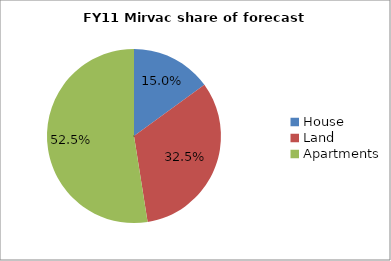
| Category | Series 0 |
|---|---|
| House  | 0.15 |
| Land | 0.325 |
| Apartments | 0.525 |